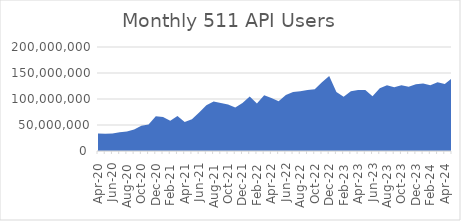
| Category | API Users |
|---|---|
| 2020-04-01 | 33617730 |
| 2020-05-01 | 33160225 |
| 2020-06-01 | 33498236 |
| 2020-07-01 | 35823655 |
| 2020-08-01 | 37631547 |
| 2020-09-01 | 41511353 |
| 2020-10-01 | 48336058 |
| 2020-11-01 | 50971270 |
| 2020-12-01 | 66960008 |
| 2021-01-01 | 65464340 |
| 2021-02-01 | 58265335 |
| 2021-03-01 | 67190791 |
| 2021-04-01 | 55619944 |
| 2021-05-01 | 60914361 |
| 2021-06-01 | 74088785 |
| 2021-07-01 | 87896377 |
| 2021-08-01 | 95109700 |
| 2021-09-01 | 92455734 |
| 2021-10-01 | 89387720 |
| 2021-11-01 | 83737254 |
| 2021-12-01 | 92543726 |
| 2022-01-01 | 104847902 |
| 2022-02-01 | 91350728 |
| 2022-03-01 | 106990963 |
| 2022-04-01 | 101938322 |
| 2022-05-01 | 95687599 |
| 2022-06-01 | 107717785 |
| 2022-07-01 | 113617402 |
| 2022-08-01 | 114912515 |
| 2022-09-01 | 117480113 |
| 2022-10-01 | 118597905 |
| 2022-11-01 | 132323098 |
| 2022-12-01 | 144102654 |
| 2023-01-01 | 113354223 |
| 2023-02-01 | 104150166 |
| 2023-03-01 | 115066254 |
| 2023-04-01 | 117243690 |
| 2023-05-01 | 117301106 |
| 2023-06-01 | 105114958 |
| 2023-07-01 | 120736139 |
| 2023-08-01 | 126536225 |
| 2023-09-01 | 122779336 |
| 2023-10-01 | 126353949 |
| 2023-11-01 | 123499240 |
| 2023-12-01 | 128599320 |
| 2024-01-01 | 129861774 |
| 2024-02-01 | 126305202 |
| 2024-03-01 | 132277499 |
| 2024-04-01 | 129043521 |
| 2024-05-01 | 139984569 |